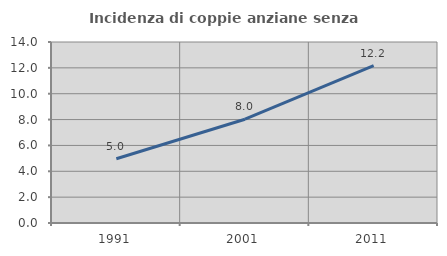
| Category | Incidenza di coppie anziane senza figli  |
|---|---|
| 1991.0 | 4.969 |
| 2001.0 | 8.029 |
| 2011.0 | 12.175 |